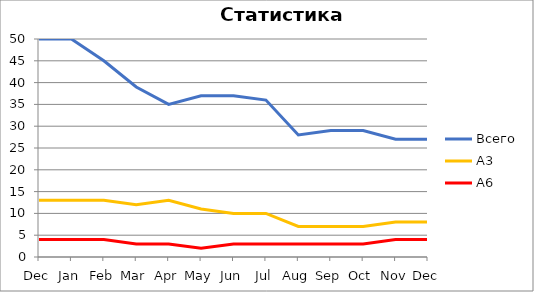
| Category | Всего | А3 | A6 |
|---|---|---|---|
| Dec | 50 | 13 | 4 |
| Jan | 50 | 13 | 4 |
| Feb | 45 | 13 | 4 |
| Mar | 39 | 12 | 3 |
| Apr | 35 | 13 | 3 |
| May | 37 | 11 | 2 |
| Jun | 37 | 10 | 3 |
| Jul | 36 | 10 | 3 |
| Aug | 28 | 7 | 3 |
| Sep | 29 | 7 | 3 |
| Oct | 29 | 7 | 3 |
| Nov | 27 | 8 | 4 |
| Dec | 27 | 8 | 4 |